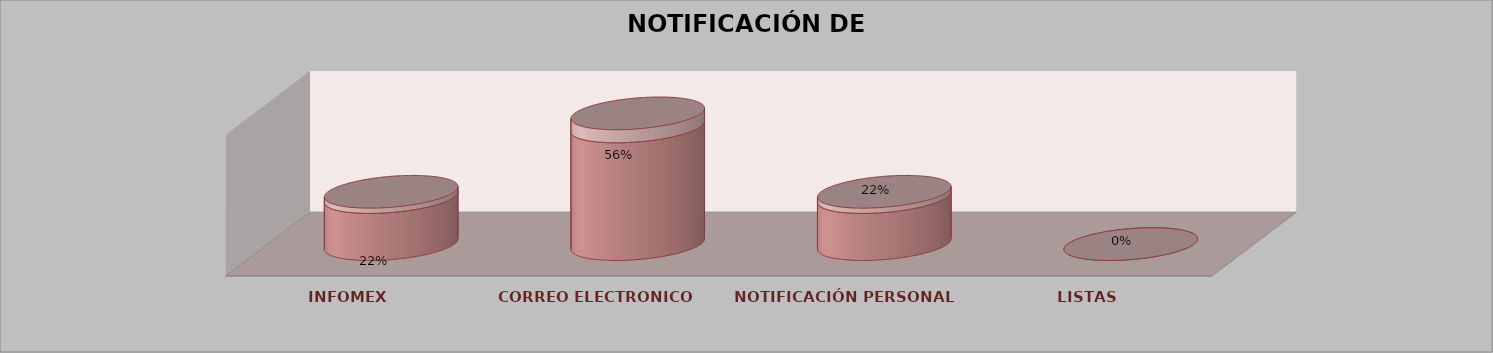
| Category | Series 0 | Series 1 | Series 2 | Series 3 | Series 4 |
|---|---|---|---|---|---|
| INFOMEX |  |  |  | 2 | 0.222 |
| CORREO ELECTRONICO |  |  |  | 5 | 0.556 |
| NOTIFICACIÓN PERSONAL |  |  |  | 2 | 0.222 |
| LISTAS |  |  |  | 0 | 0 |